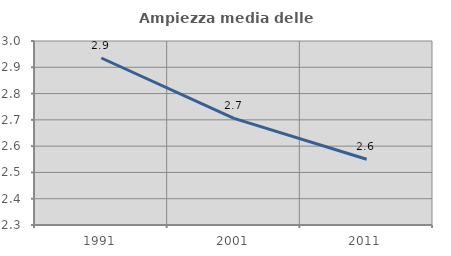
| Category | Ampiezza media delle famiglie |
|---|---|
| 1991.0 | 2.935 |
| 2001.0 | 2.706 |
| 2011.0 | 2.55 |